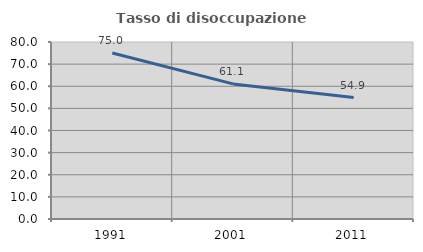
| Category | Tasso di disoccupazione giovanile  |
|---|---|
| 1991.0 | 75 |
| 2001.0 | 61.069 |
| 2011.0 | 54.902 |